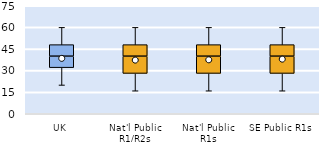
| Category | 25th | 50th | 75th |
|---|---|---|---|
| UK | 32 | 8 | 8 |
| Nat'l Public R1/R2s | 28 | 12 | 8 |
| Nat'l Public R1s | 28 | 12 | 8 |
| SE Public R1s | 28 | 12 | 8 |